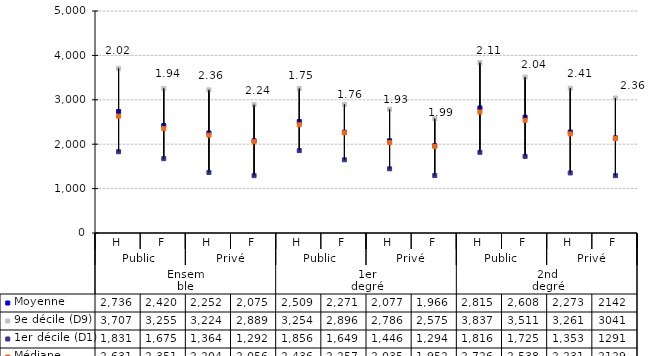
| Category | Moyenne | 9e décile (D9) | 1er décile (D1) | Médiane |
|---|---|---|---|---|
| 0 | 2736 | 3707 | 1831 | 2631 |
| 1 | 2420 | 3255 | 1675 | 2351 |
| 2 | 2252 | 3224 | 1364 | 2204 |
| 3 | 2075 | 2889 | 1292 | 2056 |
| 4 | 2509 | 3254 | 1856 | 2436 |
| 5 | 2271 | 2896 | 1649 | 2257 |
| 6 | 2077 | 2786 | 1446 | 2035 |
| 7 | 1966 | 2575 | 1294 | 1952 |
| 8 | 2815 | 3837 | 1816 | 2726 |
| 9 | 2608 | 3511 | 1725 | 2538 |
| 10 | 2273 | 3261 | 1353 | 2231 |
| 11 | 2142 | 3041 | 1291 | 2129 |